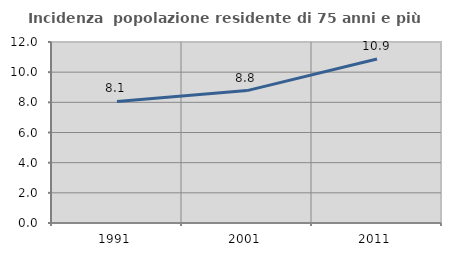
| Category | Incidenza  popolazione residente di 75 anni e più |
|---|---|
| 1991.0 | 8.059 |
| 2001.0 | 8.778 |
| 2011.0 | 10.874 |